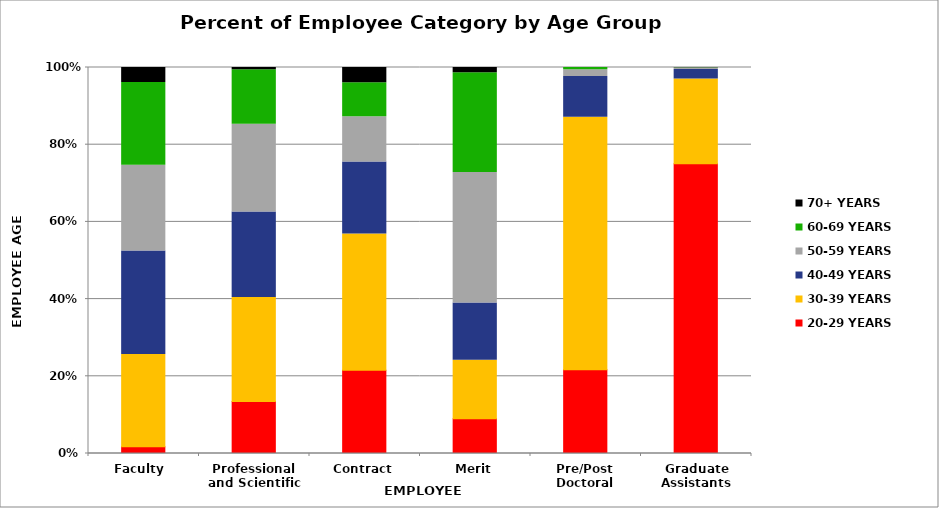
| Category | 20-29 YEARS | 30-39 YEARS | 40-49 YEARS | 50-59 YEARS | 60-69 YEARS | 70+ YEARS |
|---|---|---|---|---|---|---|
| Faculty  | 0.018 | 0.239 | 0.268 | 0.222 | 0.214 | 0.039 |
| Professional and Scientific | 0.135 | 0.269 | 0.221 | 0.227 | 0.141 | 0.006 |
| Contract | 0.216 | 0.353 | 0.186 | 0.118 | 0.088 | 0.039 |
| Merit | 0.09 | 0.152 | 0.149 | 0.338 | 0.259 | 0.014 |
| Pre/Post Doctoral | 0.217 | 0.654 | 0.106 | 0.018 | 0.006 | 0 |
| Graduate Assistants | 0.751 | 0.22 | 0.025 | 0.004 | 0.001 | 0 |